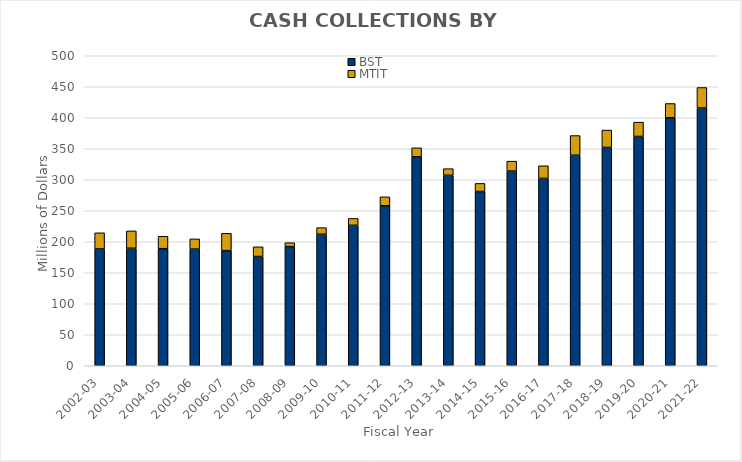
| Category | BST | MTIT |
|---|---|---|
| 2002-03 | 188.421 | 26.013 |
| 2003-04 | 189.55 | 28.001 |
| 2004-05 | 188.77 | 20.155 |
| 2005-06 | 188.152 | 16.505 |
| 2006-07 | 185.706 | 27.939 |
| 2007-08 | 176.198 | 15.641 |
| 2008-09 | 192.142 | 6.363 |
| 2009-10 | 212.143 | 10.659 |
| 2010-11 | 226.524 | 11.107 |
| 2011-12 | 258.048 | 14.414 |
| 2012-13 | 337.007 | 14.47 |
| 2013-14 | 307.194 | 10.68 |
| 2014-15 | 281.002 | 13.078 |
| 2015-16 | 313.952 | 16.045 |
| 2016-17 | 302.203 | 20.341 |
| 2017-18 | 339.534 | 31.78 |
| 2018-19 | 352.162 | 27.976 |
| 2019-20 | 369.784 | 23.102 |
| 2020-21 | 399.935 | 23.042 |
| 2021-22 | 415.743 | 33.06 |